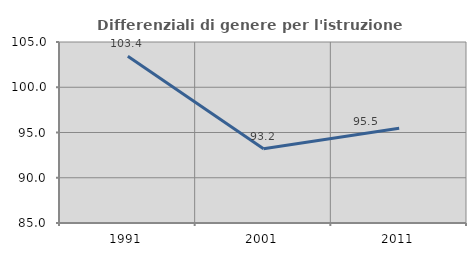
| Category | Differenziali di genere per l'istruzione superiore |
|---|---|
| 1991.0 | 103.415 |
| 2001.0 | 93.204 |
| 2011.0 | 95.468 |